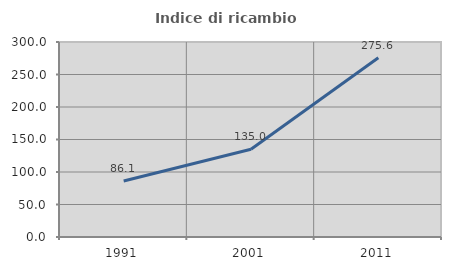
| Category | Indice di ricambio occupazionale  |
|---|---|
| 1991.0 | 86.088 |
| 2001.0 | 134.976 |
| 2011.0 | 275.638 |